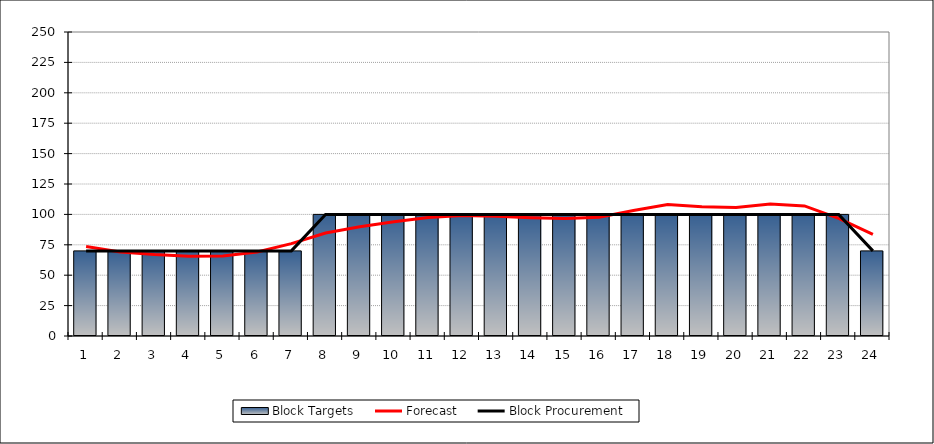
| Category | Block Targets |
|---|---|
| 1.0 | 70 |
| 2.0 | 70 |
| 3.0 | 70 |
| 4.0 | 70 |
| 5.0 | 70 |
| 6.0 | 70 |
| 7.0 | 70 |
| 8.0 | 100 |
| 9.0 | 100 |
| 10.0 | 100 |
| 11.0 | 100 |
| 12.0 | 100 |
| 13.0 | 100 |
| 14.0 | 100 |
| 15.0 | 100 |
| 16.0 | 100 |
| 17.0 | 100 |
| 18.0 | 100 |
| 19.0 | 100 |
| 20.0 | 100 |
| 21.0 | 100 |
| 22.0 | 100 |
| 23.0 | 100 |
| 24.0 | 70 |